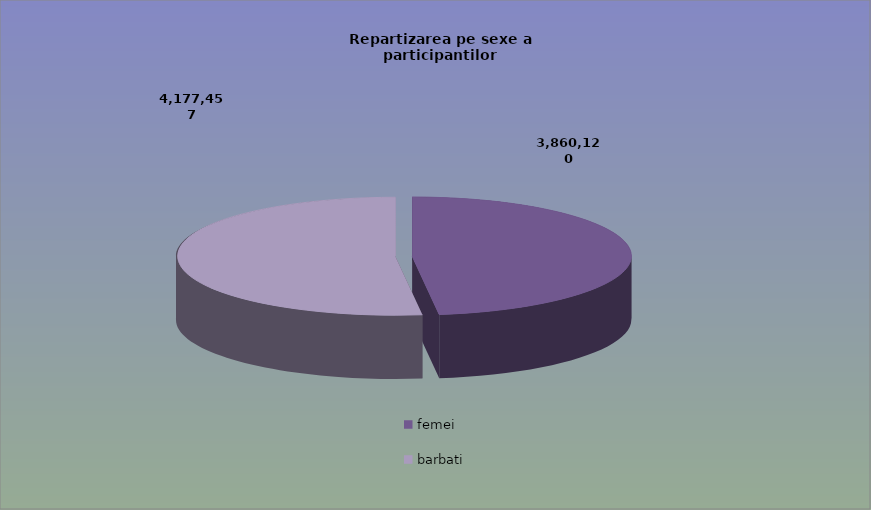
| Category | Series 0 |
|---|---|
| femei | 3860120 |
| barbati | 4177457 |